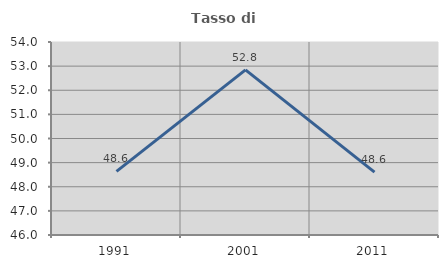
| Category | Tasso di occupazione   |
|---|---|
| 1991.0 | 48.64 |
| 2001.0 | 52.843 |
| 2011.0 | 48.607 |